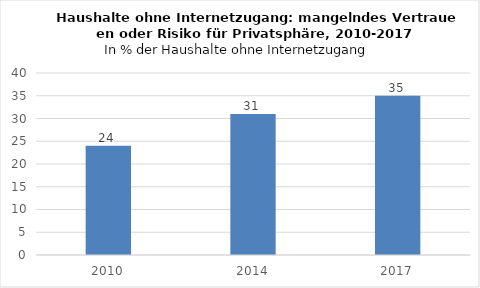
| Category | Ja |
|---|---|
| 2010.0 | 24 |
| 2014.0 | 31 |
| 2017.0 | 35 |